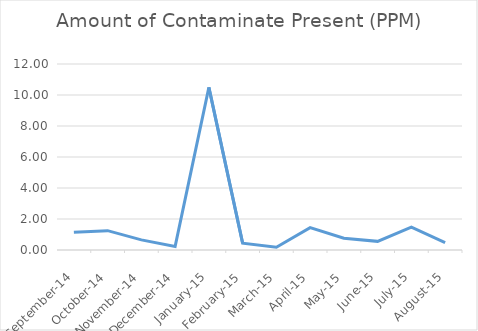
| Category | Amount of Contaminate Present (PPM) |
|---|---|
| 2014-09-01 | 1.147 |
| 2014-10-01 | 1.249 |
| 2014-11-01 | 0.654 |
| 2014-12-01 | 0.23 |
| 2015-01-01 | 10.496 |
| 2015-02-01 | 0.44 |
| 2015-03-01 | 0.18 |
| 2015-04-01 | 1.445 |
| 2015-05-01 | 0.756 |
| 2015-06-01 | 0.558 |
| 2015-07-01 | 1.472 |
| 2015-08-01 | 0.471 |